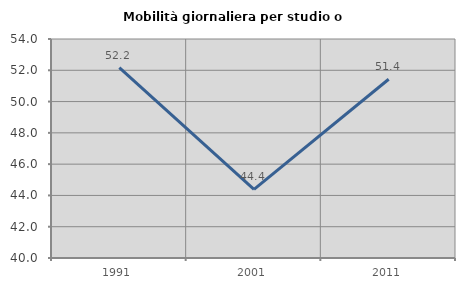
| Category | Mobilità giornaliera per studio o lavoro |
|---|---|
| 1991.0 | 52.177 |
| 2001.0 | 44.384 |
| 2011.0 | 51.429 |